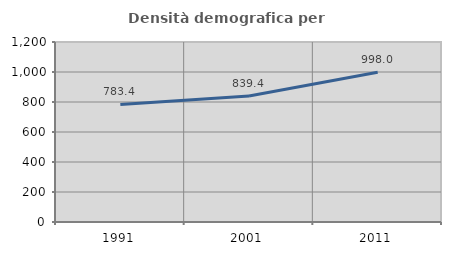
| Category | Densità demografica |
|---|---|
| 1991.0 | 783.407 |
| 2001.0 | 839.376 |
| 2011.0 | 998.006 |